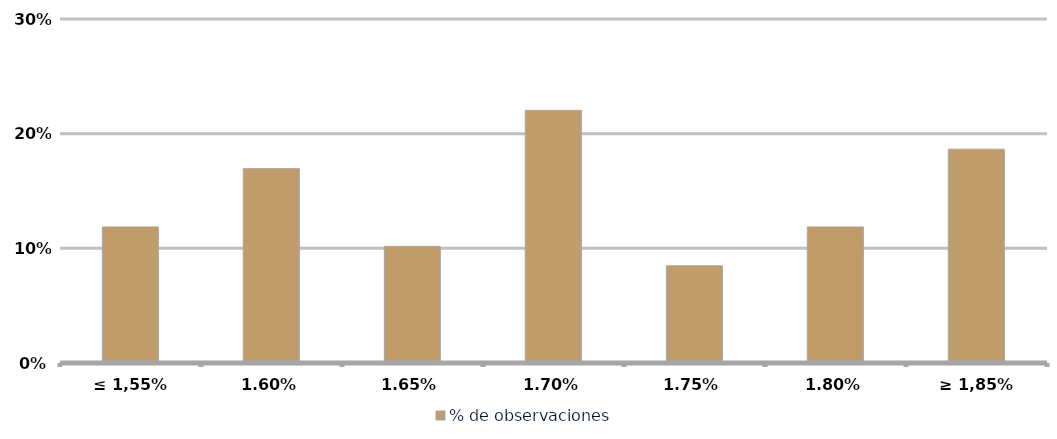
| Category | % de observaciones  |
|---|---|
| ≤ 1,55% | 0.119 |
| 1,60% | 0.169 |
| 1,65% | 0.102 |
| 1,70% | 0.22 |
| 1,75% | 0.085 |
| 1,80% | 0.119 |
| ≥ 1,85% | 0.186 |